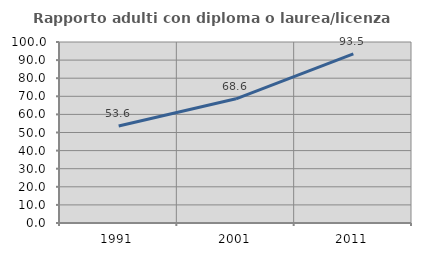
| Category | Rapporto adulti con diploma o laurea/licenza media  |
|---|---|
| 1991.0 | 53.636 |
| 2001.0 | 68.624 |
| 2011.0 | 93.459 |